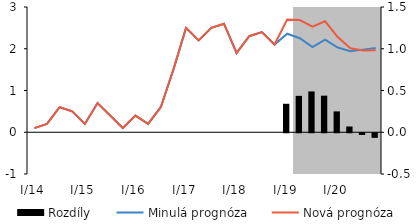
| Category | Rozdíly |
|---|---|
| I/14 | 0 |
| II | 0 |
| III | 0 |
| IV | 0 |
| I/15 | 0 |
| II | 0 |
| III | 0 |
| IV | 0 |
| I/16 | 0 |
| II | 0 |
| III | 0 |
| IV | 0 |
| I/17 | 0 |
| II | 0 |
| III | 0 |
| IV | 0 |
| I/18 | 0 |
| II | 0 |
| III | 0 |
| IV | 0 |
| I/19 | 0.341 |
| II | 0.436 |
| III | 0.489 |
| IV | 0.438 |
| I/20 | 0.25 |
| II | 0.069 |
| III | -0.02 |
| IV | -0.055 |